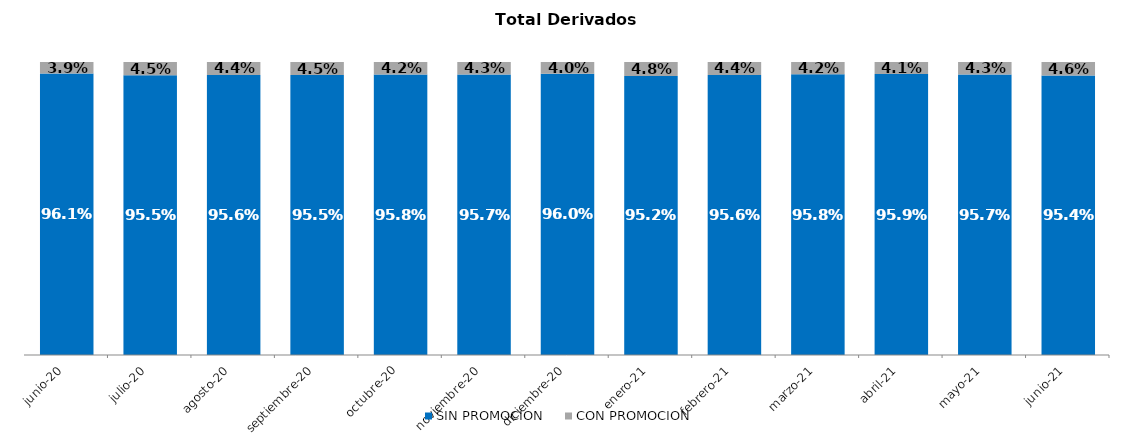
| Category | SIN PROMOCION   | CON PROMOCION   |
|---|---|---|
| 2020-06-01 | 0.961 | 0.039 |
| 2020-07-01 | 0.955 | 0.045 |
| 2020-08-01 | 0.956 | 0.044 |
| 2020-09-01 | 0.955 | 0.045 |
| 2020-10-01 | 0.958 | 0.042 |
| 2020-11-01 | 0.957 | 0.043 |
| 2020-12-01 | 0.96 | 0.04 |
| 2021-01-01 | 0.952 | 0.048 |
| 2021-02-01 | 0.956 | 0.044 |
| 2021-03-01 | 0.958 | 0.042 |
| 2021-04-01 | 0.959 | 0.041 |
| 2021-05-01 | 0.957 | 0.043 |
| 2021-06-01 | 0.954 | 0.046 |